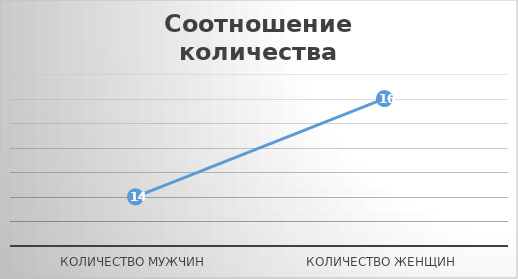
| Category | Series 0 |
|---|---|
| Количество мужчин | 14 |
| Количество женщин | 16 |